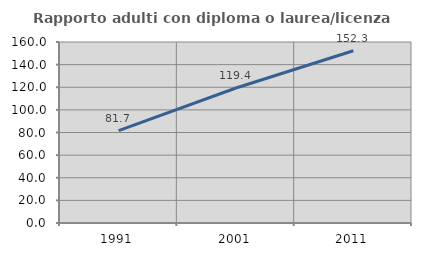
| Category | Rapporto adulti con diploma o laurea/licenza media  |
|---|---|
| 1991.0 | 81.699 |
| 2001.0 | 119.352 |
| 2011.0 | 152.296 |